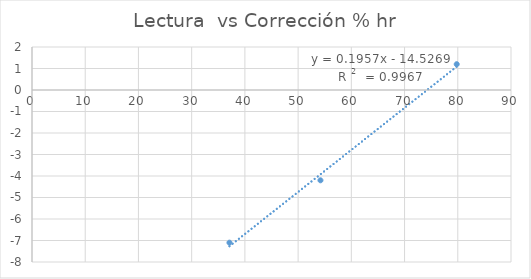
| Category | Corrección % hr |
|---|---|
| 37.1 | -7.1 |
| 54.2 | -4.2 |
| 79.8 | 1.2 |